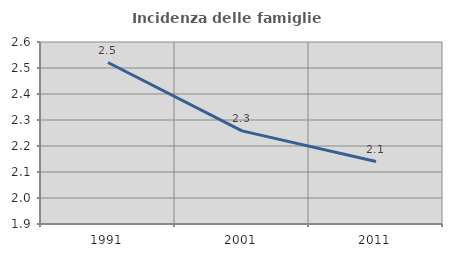
| Category | Incidenza delle famiglie numerose |
|---|---|
| 1991.0 | 2.521 |
| 2001.0 | 2.258 |
| 2011.0 | 2.14 |